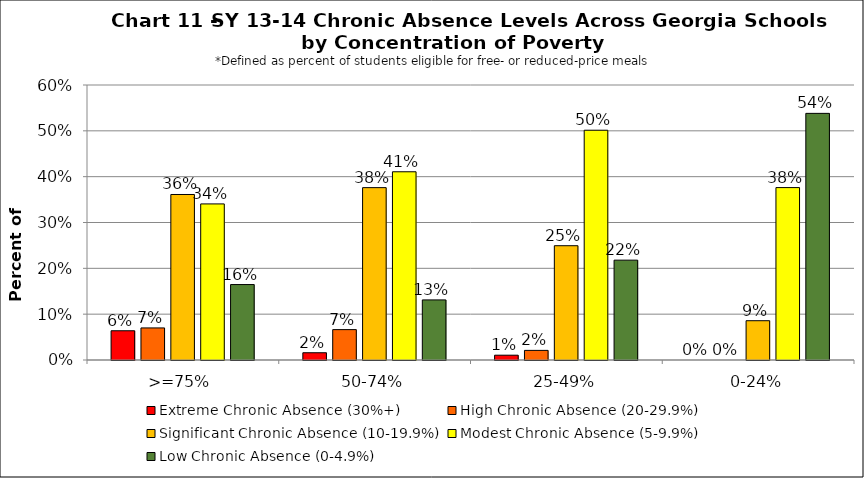
| Category | Extreme Chronic Absence (30%+) | High Chronic Absence (20-29.9%) | Significant Chronic Absence (10-19.9%) | Modest Chronic Absence (5-9.9%) | Low Chronic Absence (0-4.9%) |
|---|---|---|---|---|---|
| 0 | 0.064 | 0.07 | 0.361 | 0.341 | 0.165 |
| 1 | 0.016 | 0.066 | 0.376 | 0.411 | 0.131 |
| 2 | 0.01 | 0.021 | 0.249 | 0.501 | 0.218 |
| 3 | 0 | 0 | 0.086 | 0.376 | 0.538 |